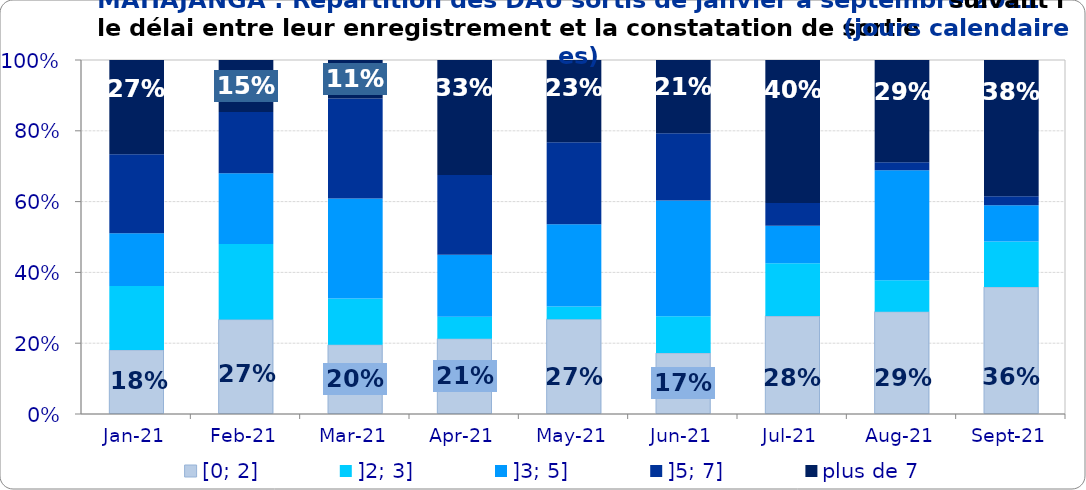
| Category | [0; 2] | ]2; 3] | ]3; 5] | ]5; 7] | plus de 7 |
|---|---|---|---|---|---|
| 2021-01-01 | 0.181 | 0.181 | 0.149 | 0.223 | 0.266 |
| 2021-02-01 | 0.267 | 0.213 | 0.2 | 0.173 | 0.147 |
| 2021-03-01 | 0.196 | 0.13 | 0.283 | 0.283 | 0.109 |
| 2021-04-01 | 0.212 | 0.062 | 0.175 | 0.225 | 0.325 |
| 2021-05-01 | 0.268 | 0.036 | 0.232 | 0.232 | 0.232 |
| 2021-06-01 | 0.172 | 0.103 | 0.328 | 0.19 | 0.207 |
| 2021-07-01 | 0.277 | 0.149 | 0.106 | 0.064 | 0.404 |
| 2021-08-01 | 0.289 | 0.089 | 0.311 | 0.022 | 0.289 |
| 2021-09-01 | 0.359 | 0.128 | 0.103 | 0.026 | 0.385 |